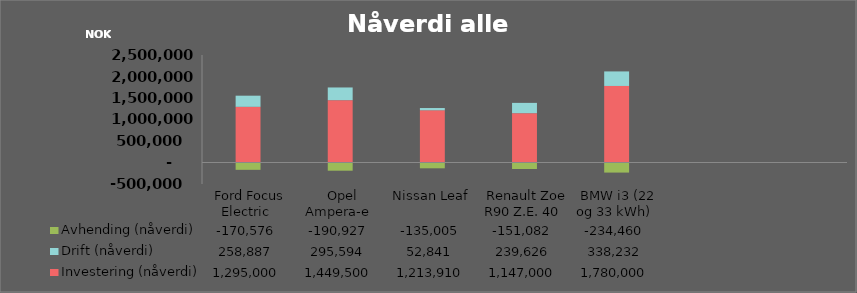
| Category | Investering (nåverdi) | Drift (nåverdi) | Avhending (nåverdi) |
|---|---|---|---|
|  Ford Focus Electric  | 1295000 | 258886.598 | -170576.218 |
|  Opel Ampera-e  | 1449500 | 295594.399 | -190926.818 |
|  Nissan Leaf  | 1213910.353 | 52840.74 | -135005.479 |
|  Renault Zoe R90 Z.E. 40  | 1147000 | 239626.463 | -151081.794 |
|  BMW i3 (22 og 33 kWh)  | 1780000 | 338232.106 | -234459.976 |